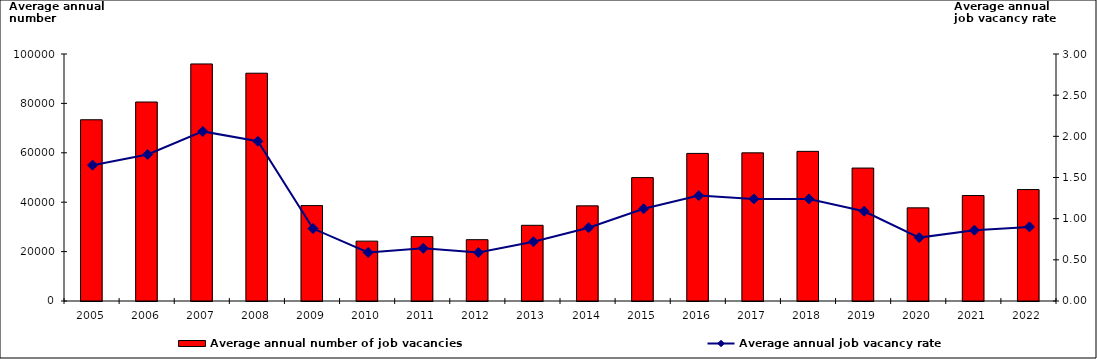
| Category | Average annual number of job vacancies |
|---|---|
| 2005.0 | 73380 |
| 2006.0 | 80557 |
| 2007.0 | 95972 |
| 2008.0 | 92222 |
| 2009.0 | 38625 |
| 2010.0 | 24239 |
| 2011.0 | 26057 |
| 2012.0 | 24825 |
| 2013.0 | 30643 |
| 2014.0 | 38523 |
| 2015.0 | 49952 |
| 2016.0 | 59753 |
| 2017.0 | 59987 |
| 2018.0 | 60586 |
| 2019.0 | 53821 |
| 2020.0 | 37714 |
| 2021.0 | 42704 |
| 2022.0 | 45111 |